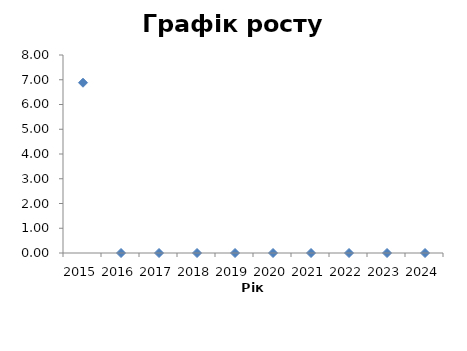
| Category | Series 0 |
|---|---|
| 2015.0 | 6.879 |
| 2016.0 | 0 |
| 2017.0 | 0 |
| 2018.0 | 0 |
| 2019.0 | 0 |
| 2020.0 | 0 |
| 2021.0 | 0 |
| 2022.0 | 0 |
| 2023.0 | 0 |
| 2024.0 | 0 |